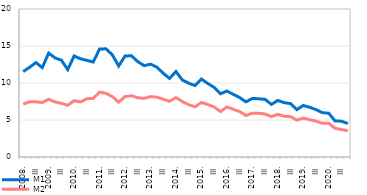
| Category | M1 | M2 |
|---|---|---|
| 2008. | 11.541 | 7.133 |
| II | 12.117 | 7.468 |
| III | 12.759 | 7.452 |
| IV | 12.081 | 7.363 |
| 2009. | 14.049 | 7.807 |
| II | 13.385 | 7.444 |
| III | 13.083 | 7.248 |
| IV | 11.81 | 6.988 |
| 2010. | 13.656 | 7.609 |
| II | 13.277 | 7.434 |
| III | 13.06 | 7.871 |
| IV | 12.834 | 7.919 |
| 2011. | 14.592 | 8.771 |
| II | 14.618 | 8.614 |
| III | 13.812 | 8.163 |
| IV | 12.299 | 7.403 |
| 2012. | 13.639 | 8.164 |
| II | 13.689 | 8.283 |
| III | 12.893 | 8.004 |
| IV | 12.342 | 7.926 |
| 2013. | 12.547 | 8.164 |
| II | 12.14 | 8.086 |
| III | 11.324 | 7.815 |
| IV | 10.614 | 7.526 |
| 2014. | 11.557 | 8.031 |
| II | 10.403 | 7.493 |
| III | 9.972 | 7.067 |
| IV | 9.656 | 6.777 |
| 2015. | 10.539 | 7.363 |
| II | 9.933 | 7.097 |
| III | 9.408 | 6.752 |
| IV | 8.554 | 6.143 |
| 2016. | 8.914 | 6.764 |
| II | 8.476 | 6.441 |
| III | 8.039 | 6.151 |
| IV | 7.449 | 5.602 |
| 2017. | 7.914 | 5.927 |
| II | 7.864 | 5.906 |
| III | 7.796 | 5.812 |
| IV | 7.109 | 5.459 |
| 2018. | 7.639 | 5.765 |
| II | 7.345 | 5.506 |
| III | 7.214 | 5.455 |
| IV | 6.403 | 4.984 |
| 2019. | 6.962 | 5.26 |
| II | 6.724 | 5.045 |
| III | 6.399 | 4.846 |
| IV | 5.996 | 4.566 |
| 2020. | 5.913 | 4.555 |
| II | 4.878 | 3.878 |
| III | 4.836 | 3.717 |
| IV | 4.517 | 3.547 |